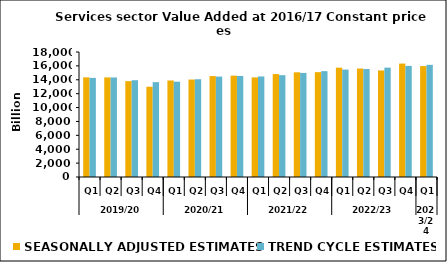
| Category | SEASONALLY ADJUSTED ESTIMATES | TREND CYCLE ESTIMATES |
|---|---|---|
| 0 | 14348.665 | 14272.368 |
| 1 | 14339.007 | 14331.778 |
| 2 | 13799.999 | 13936.263 |
| 3 | 12997.325 | 13657.04 |
| 4 | 13896.256 | 13724.281 |
| 5 | 14033.984 | 14074.68 |
| 6 | 14531.137 | 14458.271 |
| 7 | 14592.993 | 14542.59 |
| 8 | 14343.098 | 14479.907 |
| 9 | 14819.974 | 14661.105 |
| 10 | 15075.76 | 14986.424 |
| 11 | 15095.846 | 15242.055 |
| 12 | 15744.29 | 15468.622 |
| 13 | 15619.388 | 15545.556 |
| 14 | 15341.04 | 15746.702 |
| 15 | 16332.19 | 15996.858 |
| 16 | 15972.1 | 16150.451 |